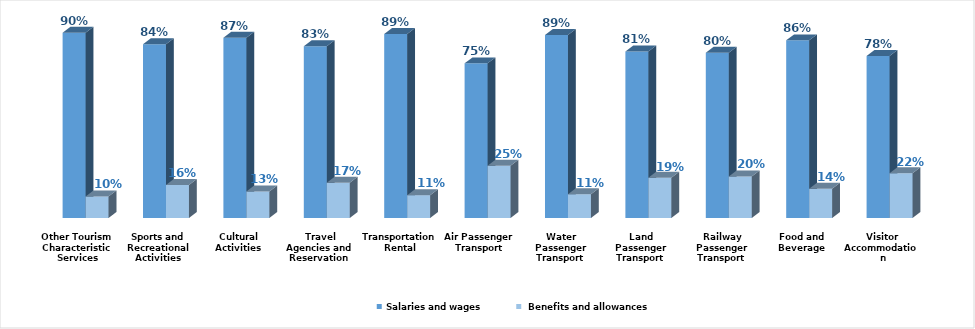
| Category | Salaries and wages |  Benefits and allowances  |
|---|---|---|
| Visitor Accommodation | 0.783 | 0.217 |
| Food and Beverage | 0.859 | 0.141 |
| Railway Passenger Transport | 0.799 | 0.201 |
| Land Passenger Transport | 0.805 | 0.195 |
| Water Passenger Transport | 0.885 | 0.115 |
| Air Passenger Transport | 0.748 | 0.252 |
| Transportation Rental | 0.89 | 0.11 |
| Travel Agencies and Reservation Services  | 0.83 | 0.17 |
| Cultural Activities | 0.872 | 0.128 |
| Sports and Recreational Activities | 0.84 | 0.16 |
| Other Tourism Characteristic Services | 0.896 | 0.104 |